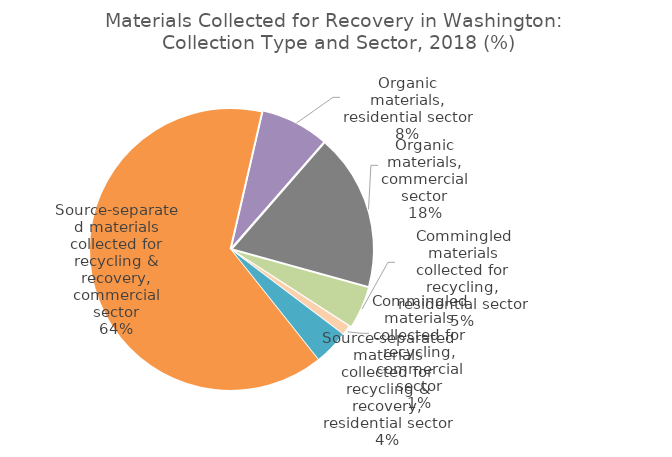
| Category | Series 0 |
|---|---|
| Organic materials, residential sector | 834041.51 |
| Organic materials, commercial sector | 1913151.229 |
| Commingled materials collected for recycling, residential sector | 519618 |
| Commingled materials collected for recycling, commercial sector | 123547 |
| Source-separated materials collected for recycling & recovery, residential sector | 429123.24 |
| Source-separated materials collected for recycling & recovery, commercial sector | 6876938.29 |